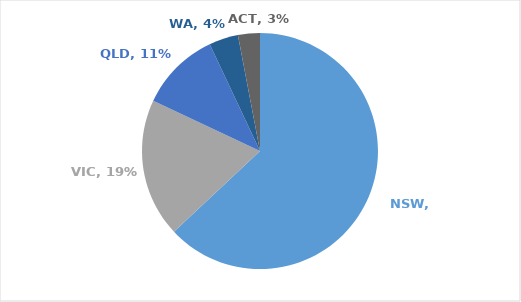
| Category | Series 0 |
|---|---|
| NSW | 0.63 |
| VIC | 0.19 |
| QLD | 0.11 |
| WA | 0.04 |
| ACT | 0.03 |